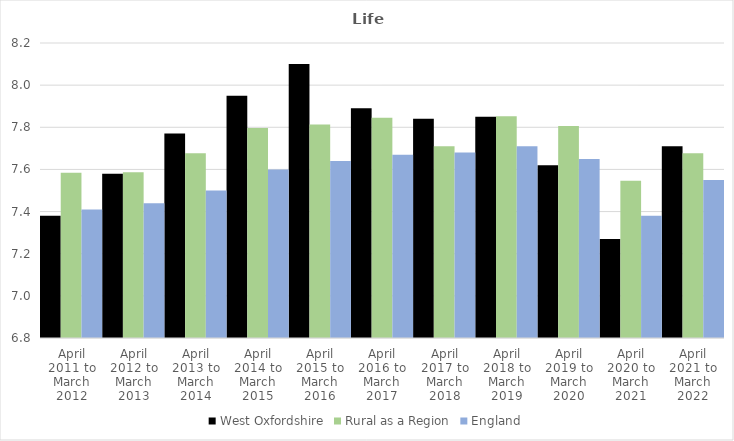
| Category | West Oxfordshire | Rural as a Region | England |
|---|---|---|---|
| April 2011 to March 2012 | 7.38 | 7.584 | 7.41 |
| April 2012 to March 2013 | 7.58 | 7.586 | 7.44 |
| April 2013 to March 2014 | 7.77 | 7.677 | 7.5 |
| April 2014 to March 2015 | 7.95 | 7.797 | 7.6 |
| April 2015 to March 2016 | 8.1 | 7.813 | 7.64 |
| April 2016 to March 2017 | 7.89 | 7.845 | 7.67 |
| April 2017 to March 2018 | 7.84 | 7.71 | 7.68 |
| April 2018 to March 2019 | 7.85 | 7.852 | 7.71 |
| April 2019 to March 2020 | 7.62 | 7.806 | 7.65 |
| April 2020 to March 2021 | 7.27 | 7.546 | 7.38 |
| April 2021 to March 2022 | 7.71 | 7.677 | 7.55 |